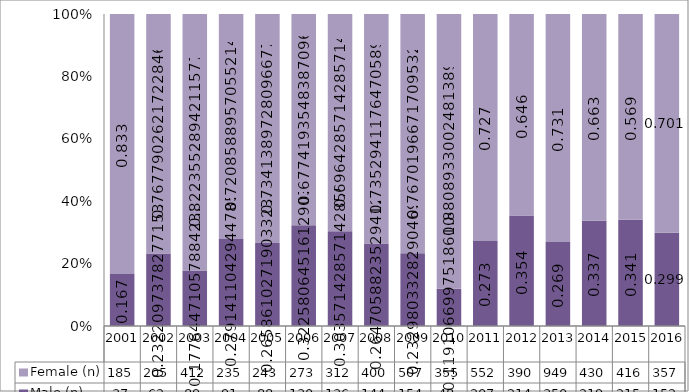
| Category | Male (n) | Female (n) |
|---|---|---|
| 2001.0 | 37 | 185 |
| 2002.0 | 62 | 205 |
| 2003.0 | 89 | 412 |
| 2004.0 | 91 | 235 |
| 2005.0 | 88 | 243 |
| 2006.0 | 130 | 273 |
| 2007.0 | 136 | 312 |
| 2008.0 | 144 | 400 |
| 2009.0 | 154 | 507 |
| 2010.0 | 48 | 355 |
| 2011.0 | 207 | 552 |
| 2012.0 | 214 | 390 |
| 2013.0 | 350 | 949 |
| 2014.0 | 219 | 430 |
| 2015.0 | 215 | 416 |
| 2016.0 | 152 | 357 |